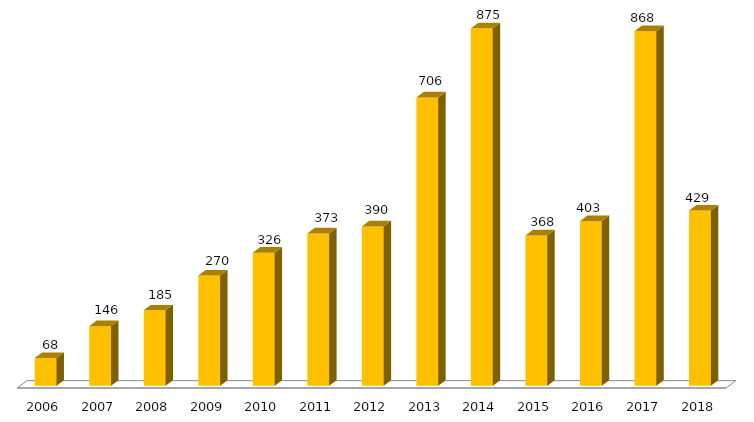
| Category | Pós - Graduação UFGD |
|---|---|
| 2006.0 | 68 |
| 2007.0 | 146 |
| 2008.0 | 185 |
| 2009.0 | 270 |
| 2010.0 | 326 |
| 2011.0 | 373 |
| 2012.0 | 390 |
| 2013.0 | 706 |
| 2014.0 | 875 |
| 2015.0 | 368 |
| 2016.0 | 403 |
| 2017.0 | 868 |
| 2018.0 | 429 |